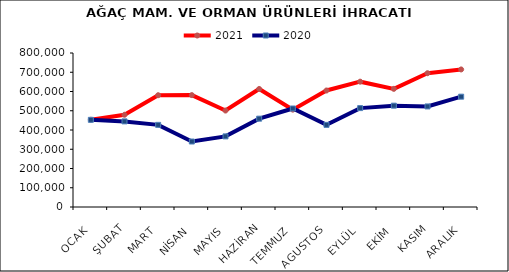
| Category | 2021 | 2020 |
|---|---|---|
| OCAK | 453138.955 | 452779.887 |
| ŞUBAT | 479075.043 | 444728.802 |
| MART | 580709.264 | 426630.086 |
| NİSAN | 581276.67 | 340174.23 |
| MAYIS | 501065.424 | 366810.395 |
| HAZİRAN | 613146.976 | 458876.295 |
| TEMMUZ | 505783.279 | 511745.764 |
| AGUSTOS | 605268.335 | 426557.836 |
| EYLÜL | 651028.916 | 513783.411 |
| EKİM | 613751.887 | 526444.508 |
| KASIM | 695001.897 | 522362.642 |
| ARALIK | 714586.466 | 573079.919 |